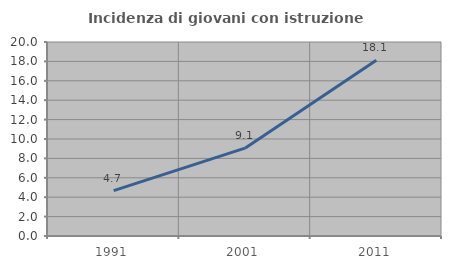
| Category | Incidenza di giovani con istruzione universitaria |
|---|---|
| 1991.0 | 4.675 |
| 2001.0 | 9.054 |
| 2011.0 | 18.117 |